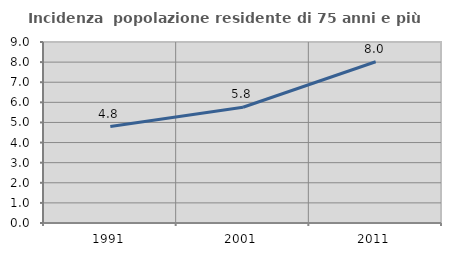
| Category | Incidenza  popolazione residente di 75 anni e più |
|---|---|
| 1991.0 | 4.797 |
| 2001.0 | 5.756 |
| 2011.0 | 8.016 |